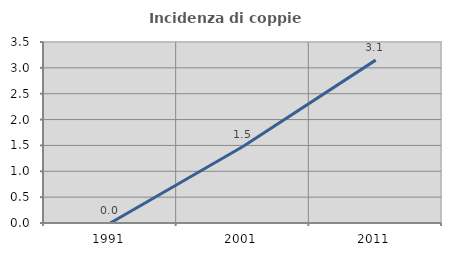
| Category | Incidenza di coppie miste |
|---|---|
| 1991.0 | 0 |
| 2001.0 | 1.478 |
| 2011.0 | 3.15 |